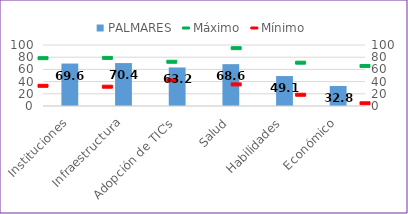
| Category | PALMARES |
|---|---|
| Instituciones | 69.596 |
| Infraestructura | 70.37 |
| Adopción de TIC's | 63.188 |
| Salud | 68.614 |
| Habilidades | 49.103 |
| Económico | 32.846 |